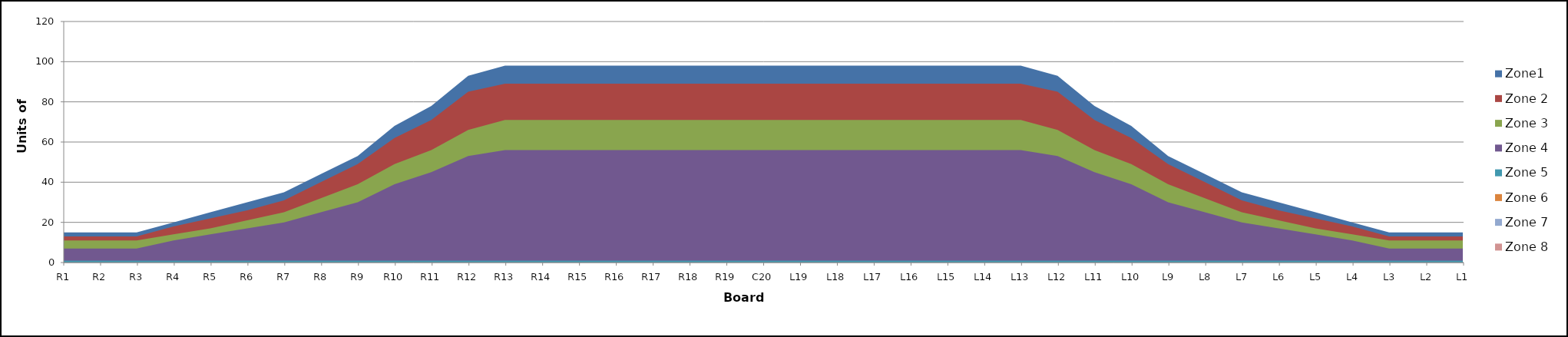
| Category | Zone1 | Zone 2 | Zone 3 | Zone 4 | Zone 5 | Zone 6 | Zone 7 | Zone 8 |
|---|---|---|---|---|---|---|---|---|
| L1 | 15 | 13 | 11 | 7 | 1 |  |  |  |
| L2 | 15 | 13 | 11 | 7 | 1 |  |  |  |
| L3 | 15 | 13 | 11 | 7 | 1 |  |  |  |
| L4 | 20 | 18 | 14 | 11 | 1 |  |  |  |
| L5 | 25 | 22 | 17 | 14 | 1 |  |  |  |
| L6 | 30 | 26 | 21 | 17 | 1 |  |  |  |
| L7 | 35 | 31 | 25 | 20 | 1 |  |  |  |
| L8 | 44 | 40 | 32 | 25 | 1 |  |  |  |
| L9 | 53 | 49 | 39 | 30 | 1 |  |  |  |
| L10 | 68 | 62 | 49 | 39 | 1 |  |  |  |
| L11 | 78 | 71 | 56 | 45 | 1 |  |  |  |
| L12 | 93 | 85 | 66 | 53 | 1 |  |  |  |
| L13 | 98 | 89 | 71 | 56 | 1 |  |  |  |
| L14 | 98 | 89 | 71 | 56 | 1 |  |  |  |
| L15 | 98 | 89 | 71 | 56 | 1 |  |  |  |
| L16 | 98 | 89 | 71 | 56 | 1 |  |  |  |
| L17 | 98 | 89 | 71 | 56 | 1 |  |  |  |
| L18 | 98 | 89 | 71 | 56 | 1 |  |  |  |
| L19 | 98 | 89 | 71 | 56 | 1 |  |  |  |
| C20 | 98 | 89 | 71 | 56 | 1 |  |  |  |
| R19 | 98 | 89 | 71 | 56 | 1 |  |  |  |
| R18 | 98 | 89 | 71 | 56 | 1 |  |  |  |
| R17 | 98 | 89 | 71 | 56 | 1 |  |  |  |
| R16 | 98 | 89 | 71 | 56 | 1 |  |  |  |
| R15 | 98 | 89 | 71 | 56 | 1 |  |  |  |
| R14 | 98 | 89 | 71 | 56 | 1 |  |  |  |
| R13 | 98 | 89 | 71 | 56 | 1 |  |  |  |
| R12 | 93 | 85 | 66 | 53 | 1 |  |  |  |
| R11 | 78 | 71 | 56 | 45 | 1 |  |  |  |
| R10 | 68 | 62 | 49 | 39 | 1 |  |  |  |
| R9 | 53 | 49 | 39 | 30 | 1 |  |  |  |
| R8 | 44 | 40 | 32 | 25 | 1 |  |  |  |
| R7 | 35 | 31 | 25 | 20 | 1 |  |  |  |
| R6 | 30 | 26 | 21 | 17 | 1 |  |  |  |
| R5 | 25 | 22 | 17 | 14 | 1 |  |  |  |
| R4 | 20 | 18 | 14 | 11 | 1 |  |  |  |
| R3 | 15 | 13 | 11 | 7 | 1 |  |  |  |
| R2 | 15 | 13 | 11 | 7 | 1 |  |  |  |
| R1 | 15 | 13 | 11 | 7 | 1 |  |  |  |